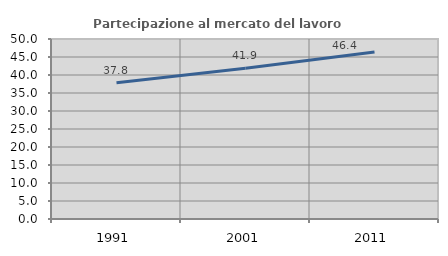
| Category | Partecipazione al mercato del lavoro  femminile |
|---|---|
| 1991.0 | 37.825 |
| 2001.0 | 41.875 |
| 2011.0 | 46.384 |